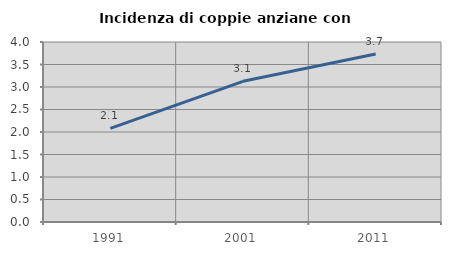
| Category | Incidenza di coppie anziane con figli |
|---|---|
| 1991.0 | 2.079 |
| 2001.0 | 3.127 |
| 2011.0 | 3.734 |